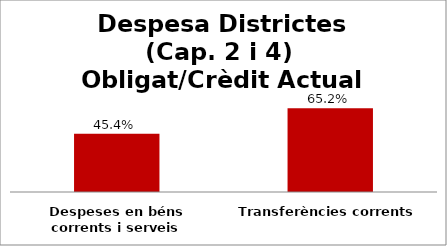
| Category | Series 0 |
|---|---|
| Despeses en béns corrents i serveis | 0.454 |
| Transferències corrents | 0.652 |